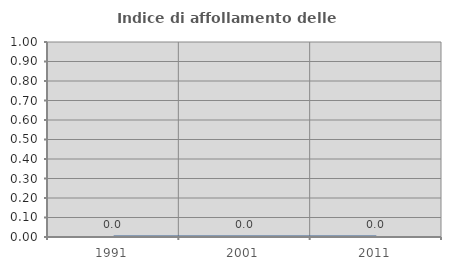
| Category | Indice di affollamento delle abitazioni  |
|---|---|
| 1991.0 | 0 |
| 2001.0 | 0 |
| 2011.0 | 0 |